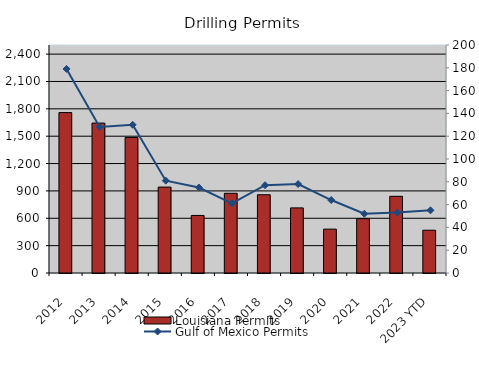
| Category | Louisiana Permits |
|---|---|
| 2012 | 1759 |
| 2013 | 1644 |
| 2014 | 1486 |
| 2015 | 942 |
| 2016 | 631 |
| 2017 | 874 |
| 2018 | 858 |
| 2019 | 714 |
| 2020 | 481 |
| 2021 | 596 |
| 2022 | 841 |
| 2023 YTD | 469 |